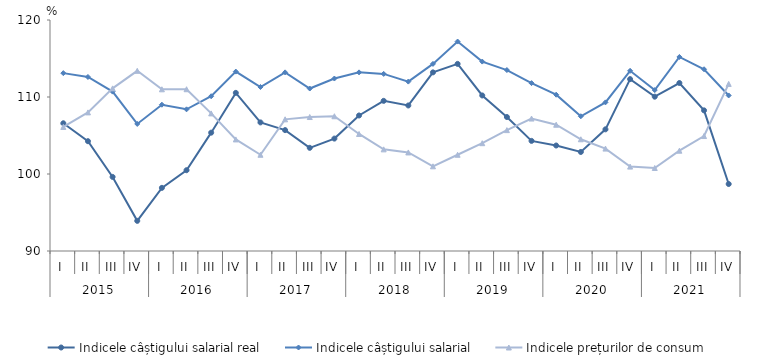
| Category | Indicele câștigului salarial real | Indicele câștigului salarial | Indicele prețurilor de consum |
|---|---|---|---|
| 0 | 106.588 | 113.1 | 106.11 |
| 1 | 104.259 | 112.6 | 108 |
| 2 | 99.622 | 110.7 | 111.12 |
| 3 | 93.915 | 106.5 | 113.4 |
| 4 | 98.2 | 109 | 111 |
| 5 | 100.491 | 108.4 | 111.01 |
| 6 | 105.369 | 110.1 | 107.87 |
| 7 | 110.537 | 113.3 | 104.49 |
| 8 | 106.7 | 111.3 | 102.5 |
| 9 | 105.7 | 113.2 | 107.1 |
| 10 | 103.4 | 111.1 | 107.4 |
| 11 | 104.6 | 112.4 | 107.5 |
| 12 | 107.6 | 113.2 | 105.2 |
| 13 | 109.5 | 113 | 103.2 |
| 14 | 108.9 | 112 | 102.8 |
| 15 | 113.2 | 114.3 | 101 |
| 16 | 114.3 | 117.2 | 102.5 |
| 17 | 110.2 | 114.6 | 104 |
| 18 | 107.4 | 113.5 | 105.7 |
| 19 | 104.3 | 111.8 | 107.2 |
| 20 | 103.7 | 110.3 | 106.4 |
| 21 | 102.861 | 107.5 | 104.51 |
| 22 | 105.8 | 109.3 | 103.3 |
| 23 | 112.322 | 113.4 | 100.96 |
| 24 | 110.042 | 110.9 | 100.78 |
| 25 | 111.816 | 115.2 | 103.026 |
| 26 | 108.263 | 113.6 | 104.93 |
| 27 | 98.7 | 110.2 | 111.7 |